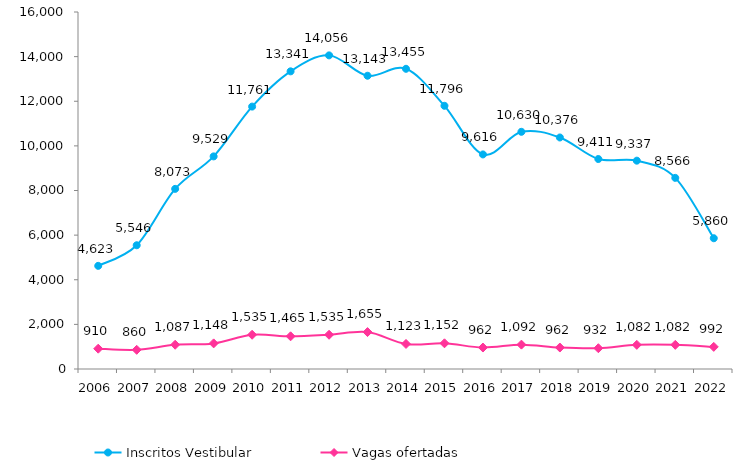
| Category | Inscritos Vestibular |
|---|---|
| 2006.0 | 4623 |
| 2007.0 | 5546 |
| 2008.0 | 8073 |
| 2009.0 | 9529 |
| 2010.0 | 11761 |
| 2011.0 | 13341 |
| 2012.0 | 14056 |
| 2013.0 | 13143 |
| 2014.0 | 13455 |
| 2015.0 | 11796 |
| 2016.0 | 9616 |
| 2017.0 | 10630 |
| 2018.0 | 10376 |
| 2019.0 | 9411 |
| 2020.0 | 9337 |
| 2021.0 | 8566 |
| 2022.0 | 5860 |